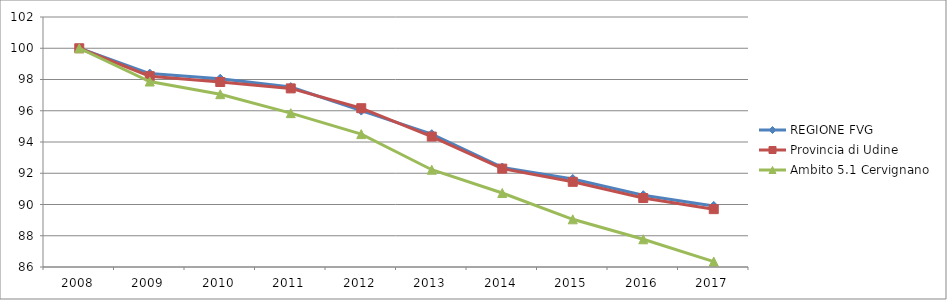
| Category | REGIONE FVG | Provincia di Udine | Ambito 5.1 Cervignano |
|---|---|---|---|
| 2008.0 | 100 | 100 | 100 |
| 2009.0 | 98.378 | 98.213 | 97.87 |
| 2010.0 | 98.049 | 97.839 | 97.061 |
| 2011.0 | 97.515 | 97.431 | 95.847 |
| 2012.0 | 96.012 | 96.162 | 94.505 |
| 2013.0 | 94.5 | 94.348 | 92.226 |
| 2014.0 | 92.37 | 92.296 | 90.735 |
| 2015.0 | 91.632 | 91.451 | 89.052 |
| 2016.0 | 90.595 | 90.414 | 87.774 |
| 2017.0 | 89.908 | 89.702 | 86.347 |